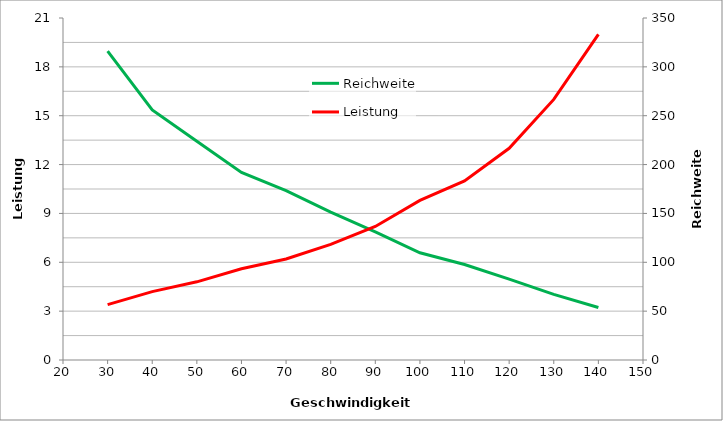
| Category | Reichweite |
|---|---|
| 30.0 | 316.176 |
| 40.0 | 255.952 |
| 50.0 | 223.958 |
| 60.0 | 191.964 |
| 70.0 | 173.387 |
| 80.0 | 151.408 |
| 90.0 | 131.098 |
| 100.0 | 109.694 |
| 110.0 | 97.727 |
| 120.0 | 82.692 |
| 130.0 | 67.188 |
| 140.0 | 53.75 |